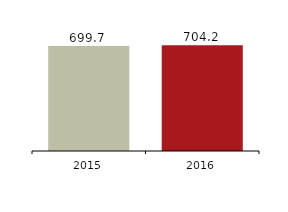
| Category | Risk exposure amount |
|---|---|
| 2016.0 | 704177 |
| 2015.0 | 699693 |